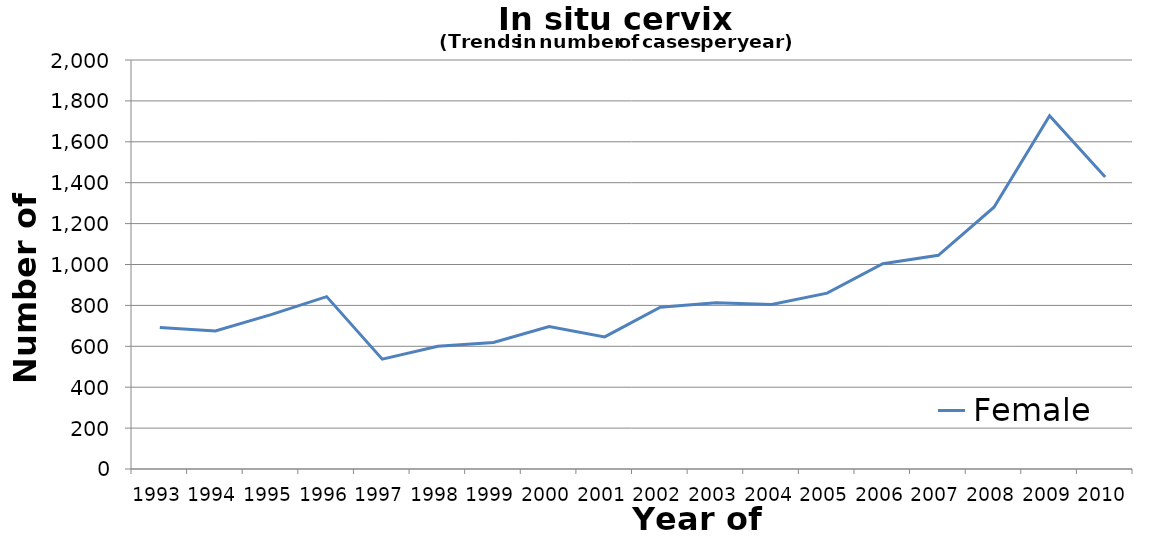
| Category | Female |
|---|---|
| 1993.0 | 692 |
| 1994.0 | 675 |
| 1995.0 | 755 |
| 1996.0 | 843 |
| 1997.0 | 537 |
| 1998.0 | 600 |
| 1999.0 | 619 |
| 2000.0 | 697 |
| 2001.0 | 646 |
| 2002.0 | 791 |
| 2003.0 | 813 |
| 2004.0 | 804 |
| 2005.0 | 860 |
| 2006.0 | 1004 |
| 2007.0 | 1045 |
| 2008.0 | 1280 |
| 2009.0 | 1728 |
| 2010.0 | 1428 |